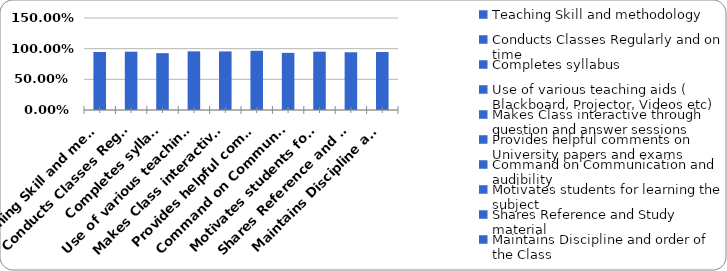
| Category | Series 0 |
|---|---|
| Teaching Skill and methodology | 0.946 |
| Conducts Classes Regularly and on time | 0.951 |
| Completes syllabus | 0.926 |
| Use of various teaching aids ( Blackboard, Projector, Videos etc) | 0.956 |
| Makes Class interactive through question and answer sessions | 0.955 |
| Provides helpful comments on University papers and exams | 0.966 |
| Command on Communication and audibility  | 0.931 |
| Motivates students for learning the subject | 0.951 |
| Shares Reference and Study material  | 0.941 |
| Maintains Discipline and order of the Class | 0.946 |